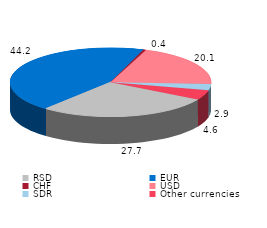
| Category | Series 0 |
|---|---|
| RSD | 27.747 |
| EUR | 44.197 |
| CHF | 0.425 |
| USD | 20.112 |
| SDR | 2.939 |
| Other currencies | 4.58 |